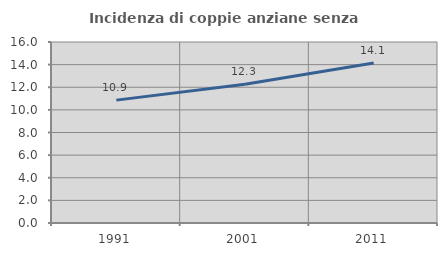
| Category | Incidenza di coppie anziane senza figli  |
|---|---|
| 1991.0 | 10.861 |
| 2001.0 | 12.257 |
| 2011.0 | 14.147 |